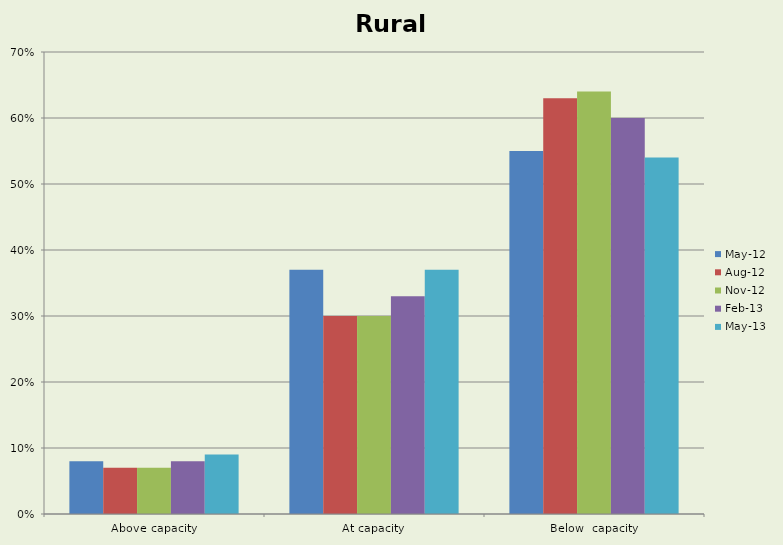
| Category | May-12 | Aug-12 | Nov-12 | Feb-13 | May-13 |
|---|---|---|---|---|---|
| Above capacity | 0.08 | 0.07 | 0.07 | 0.08 | 0.09 |
| At capacity | 0.37 | 0.3 | 0.3 | 0.33 | 0.37 |
| Below  capacity | 0.55 | 0.63 | 0.64 | 0.6 | 0.54 |